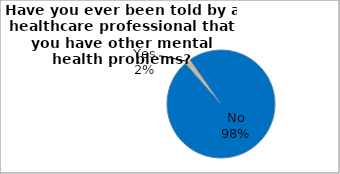
| Category | Series 0 |
|---|---|
| No | 98.234 |
| Yes | 1.766 |